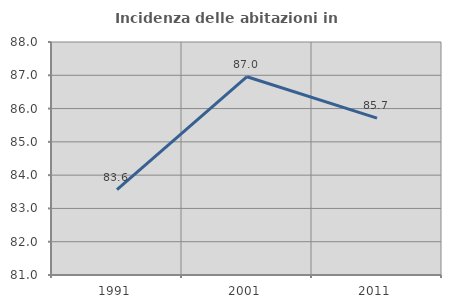
| Category | Incidenza delle abitazioni in proprietà  |
|---|---|
| 1991.0 | 83.562 |
| 2001.0 | 86.957 |
| 2011.0 | 85.714 |